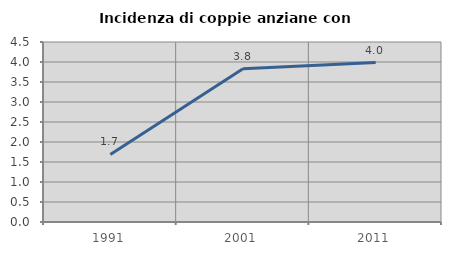
| Category | Incidenza di coppie anziane con figli |
|---|---|
| 1991.0 | 1.69 |
| 2001.0 | 3.831 |
| 2011.0 | 3.986 |